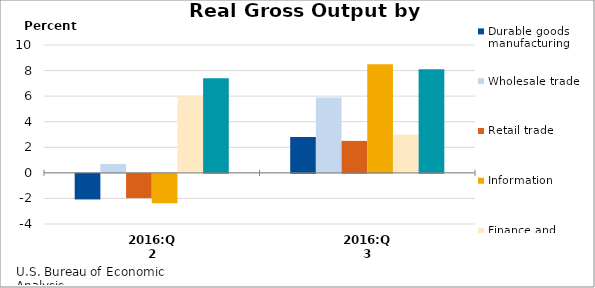
| Category | Durable goods manufacturing | Wholesale trade | Retail trade | Information | Finance and insurance | Administrative and waste management services |
|---|---|---|---|---|---|---|
| 2016:Q2 | -2 | 0.7 | -1.9 | -2.3 | 6 | 7.4 |
| 2016:Q3 | 2.8 | 5.9 | 2.5 | 8.5 | 3 | 8.1 |